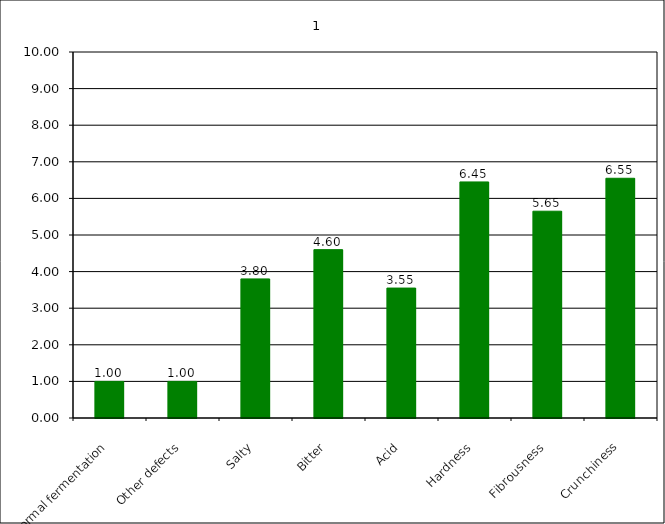
| Category | 1 |
|---|---|
| Abnormal fermentation | 1 |
| Other defects | 1 |
| Salty | 3.8 |
| Bitter | 4.6 |
| Acid | 3.55 |
| Hardness | 6.45 |
| Fibrousness | 5.65 |
| Crunchiness | 6.55 |